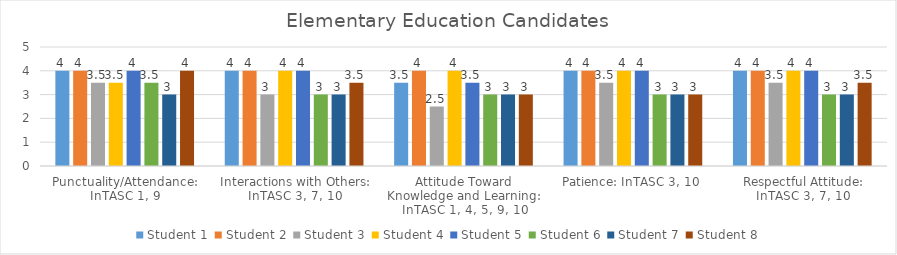
| Category | Student 1 | Student 2 | Student 3 | Student 4 | Student 5 | Student 6 | Student 7 | Student 8 |
|---|---|---|---|---|---|---|---|---|
| Punctuality/Attendance: InTASC 1, 9 | 4 | 4 | 3.5 | 3.5 | 4 | 3.5 | 3 | 4 |
| Interactions with Others: InTASC 3, 7, 10 | 4 | 4 | 3 | 4 | 4 | 3 | 3 | 3.5 |
| Attitude Toward Knowledge and Learning: InTASC 1, 4, 5, 9, 10 | 3.5 | 4 | 2.5 | 4 | 3.5 | 3 | 3 | 3 |
| Patience: InTASC 3, 10 | 4 | 4 | 3.5 | 4 | 4 | 3 | 3 | 3 |
| Respectful Attitude: InTASC 3, 7, 10 | 4 | 4 | 3.5 | 4 | 4 | 3 | 3 | 3.5 |